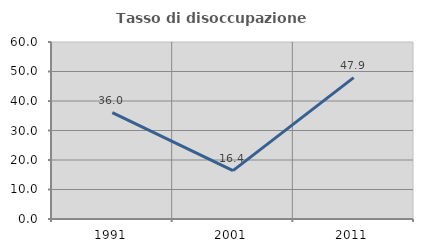
| Category | Tasso di disoccupazione giovanile  |
|---|---|
| 1991.0 | 36.036 |
| 2001.0 | 16.393 |
| 2011.0 | 47.917 |